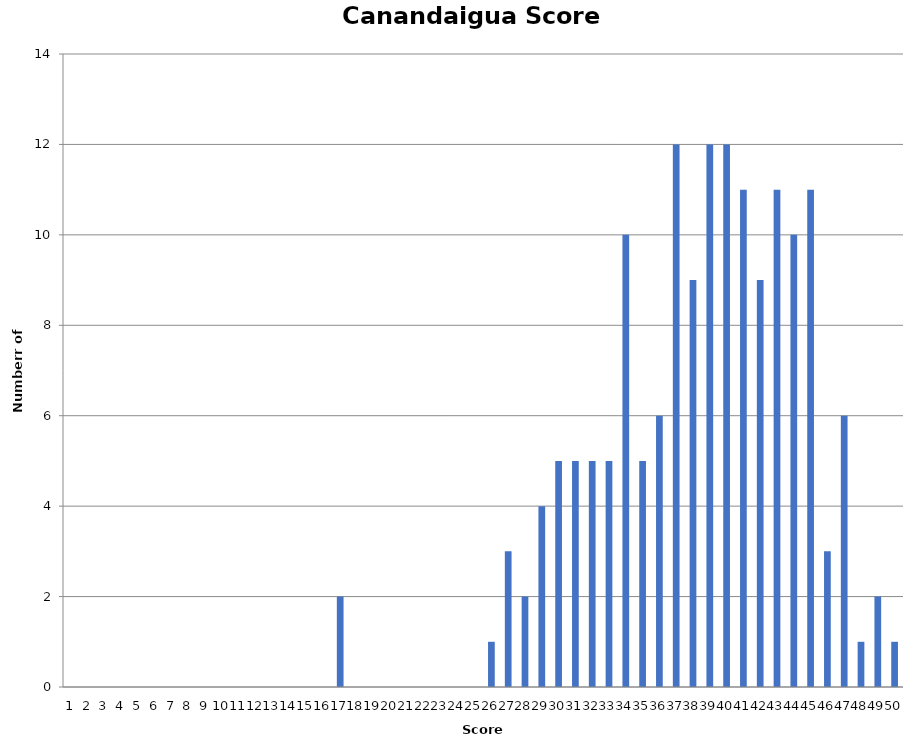
| Category | CAN |
|---|---|
| 0 | 0 |
| 1 | 0 |
| 2 | 0 |
| 3 | 0 |
| 4 | 0 |
| 5 | 0 |
| 6 | 0 |
| 7 | 0 |
| 8 | 0 |
| 9 | 0 |
| 10 | 0 |
| 11 | 0 |
| 12 | 0 |
| 13 | 0 |
| 14 | 0 |
| 15 | 0 |
| 16 | 2 |
| 17 | 0 |
| 18 | 0 |
| 19 | 0 |
| 20 | 0 |
| 21 | 0 |
| 22 | 0 |
| 23 | 0 |
| 24 | 0 |
| 25 | 1 |
| 26 | 3 |
| 27 | 2 |
| 28 | 4 |
| 29 | 5 |
| 30 | 5 |
| 31 | 5 |
| 32 | 5 |
| 33 | 10 |
| 34 | 5 |
| 35 | 6 |
| 36 | 12 |
| 37 | 9 |
| 38 | 12 |
| 39 | 12 |
| 40 | 11 |
| 41 | 9 |
| 42 | 11 |
| 43 | 10 |
| 44 | 11 |
| 45 | 3 |
| 46 | 6 |
| 47 | 1 |
| 48 | 2 |
| 49 | 1 |